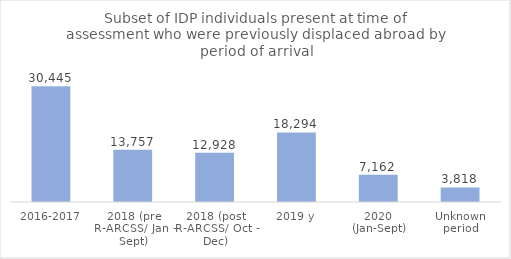
| Category | Total |
|---|---|
| 2016-2017 | 30445 |
| 2018 (pre R-ARCSS/ Jan - Sept) | 13757 |
| 2018 (post R-ARCSS/ Oct - Dec) | 12928 |
| 2019 y | 18294 |
| 2020 (Jan-Sept) | 7162 |
| Unknown period | 3818 |